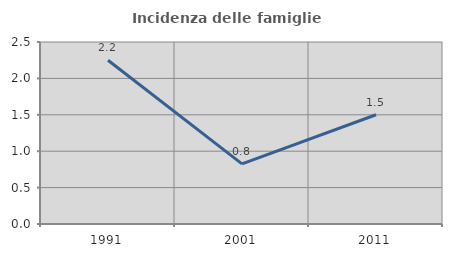
| Category | Incidenza delle famiglie numerose |
|---|---|
| 1991.0 | 2.249 |
| 2001.0 | 0.826 |
| 2011.0 | 1.5 |